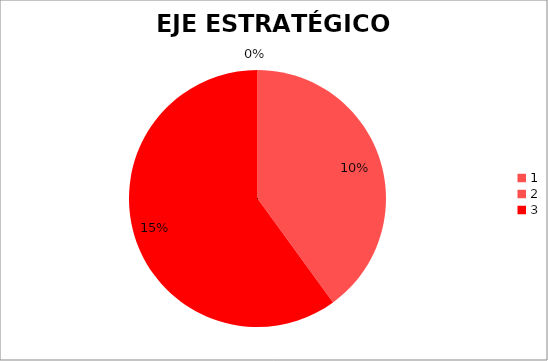
| Category | Series 0 |
|---|---|
| 0 | 0 |
| 1 | 10 |
| 2 | 15 |